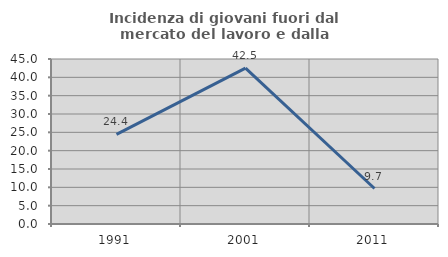
| Category | Incidenza di giovani fuori dal mercato del lavoro e dalla formazione  |
|---|---|
| 1991.0 | 24.444 |
| 2001.0 | 42.529 |
| 2011.0 | 9.677 |